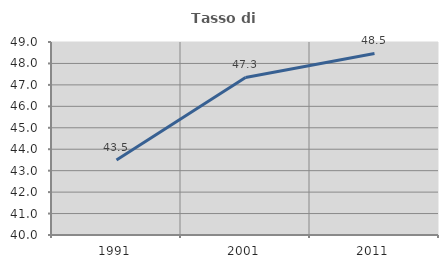
| Category | Tasso di occupazione   |
|---|---|
| 1991.0 | 43.493 |
| 2001.0 | 47.347 |
| 2011.0 | 48.464 |